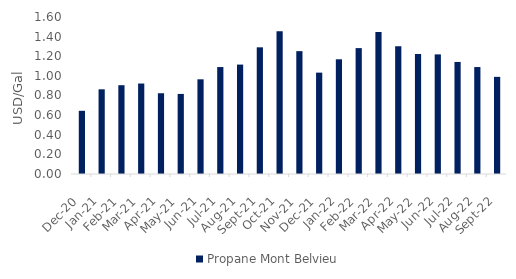
| Category | Propane Mont Belvieu |
|---|---|
| 2020-12-01 | 0.644 |
| 2021-01-01 | 0.863 |
| 2021-02-01 | 0.905 |
| 2021-03-01 | 0.922 |
| 2021-04-01 | 0.823 |
| 2021-05-01 | 0.816 |
| 2021-06-01 | 0.965 |
| 2021-07-01 | 1.09 |
| 2021-08-01 | 1.115 |
| 2021-09-01 | 1.291 |
| 2021-10-01 | 1.454 |
| 2021-11-01 | 1.252 |
| 2021-12-01 | 1.033 |
| 2022-01-01 | 1.169 |
| 2022-02-01 | 1.283 |
| 2022-03-01 | 1.448 |
| 2022-04-01 | 1.302 |
| 2022-05-01 | 1.223 |
| 2022-06-01 | 1.219 |
| 2022-07-01 | 1.142 |
| 2022-08-01 | 1.09 |
| 2022-09-01 | 0.99 |